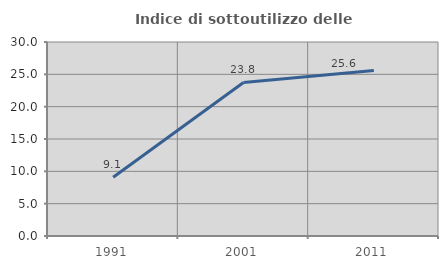
| Category | Indice di sottoutilizzo delle abitazioni  |
|---|---|
| 1991.0 | 9.091 |
| 2001.0 | 23.75 |
| 2011.0 | 25.61 |